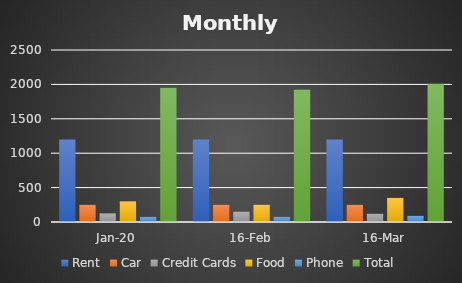
| Category | Rent | Car | Credit Cards | Food | Phone | Total |
|---|---|---|---|---|---|---|
| Jan-20 | 1200 | 250 | 125 | 300 | 75 | 1950 |
| 16-Feb | 1200 | 250 | 150 | 250 | 75 | 1925 |
| 16-Mar | 1200 | 250 | 120 | 350 | 90 | 2010 |